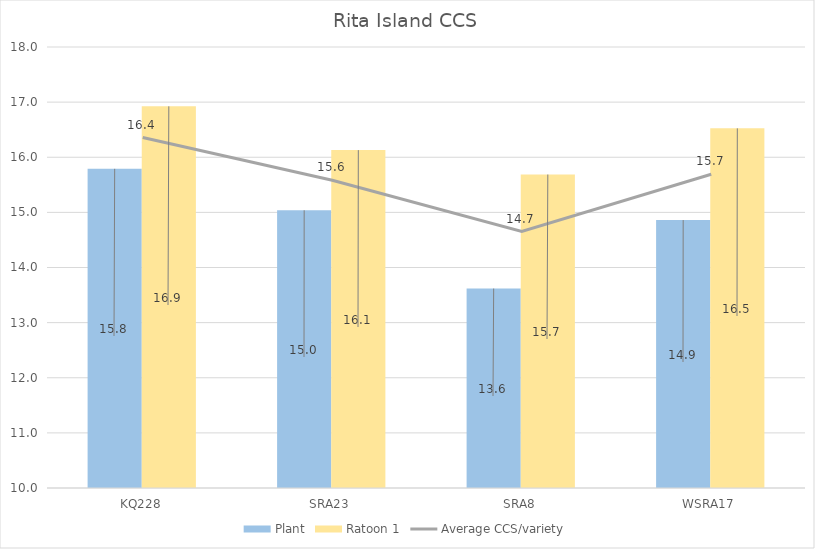
| Category | Plant | Ratoon 1 |
|---|---|---|
| KQ228 | 15.79 | 16.924 |
| SRA23 | 15.038 | 16.129 |
| SRA8 | 13.618 | 15.687 |
| WSRA17 | 14.861 | 16.524 |